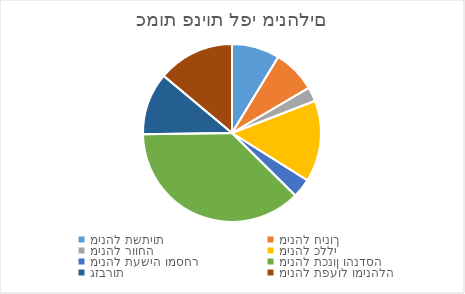
| Category | Series 0 |
|---|---|
| מינהל תשתיות | 10 |
| מינהל חינוך | 9 |
| מינהל רווחה | 3 |
| מינהל כללי | 17 |
| מינהל תעשיה ומסחר | 4 |
| מינהל תכנון והנדסה | 43 |
| גזברות | 13 |
| מינהל תפעול ומינהלה | 16 |